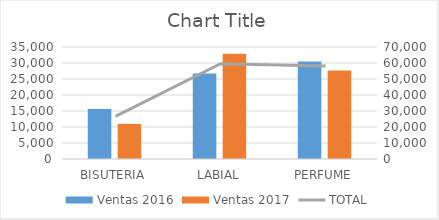
| Category | Ventas 2016 | Ventas 2017 |
|---|---|---|
| BISUTERIA | 15618 | 10968 |
| LABIAL | 26726 | 32870 |
| PERFUME | 30458 | 27620 |